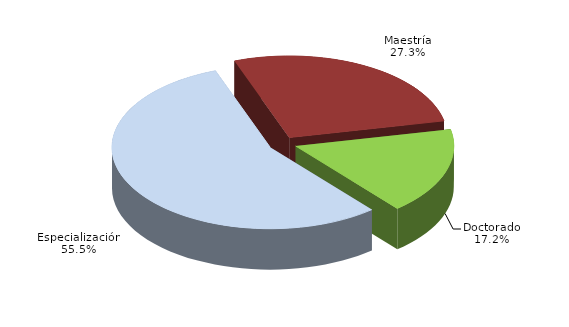
| Category | Series 0 |
|---|---|
| Especialización | 16998 |
| Maestría | 8376 |
| Doctorado | 5260 |